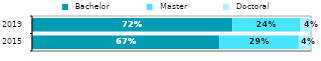
| Category |  Bachelor |  Master |  Doctoral |
|---|---|---|---|
| 2015.0 | 0.672 | 0.285 | 0.044 |
| 2019.0 | 0.717 | 0.245 | 0.038 |